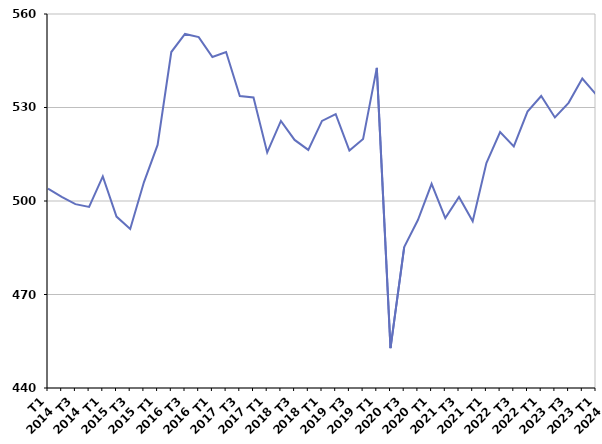
| Category | Ensemble des entrées en catégories A, B, C |
|---|---|
| T1
2014 | 504 |
| T2
2014 | 501.3 |
| T3
2014 | 499 |
| T4
2014 | 498.1 |
| T1
2015 | 507.9 |
| T2
2015 | 495 |
| T3
2015 | 491 |
| T4
2015 | 506 |
| T1
2016 | 518 |
| T2
2016 | 547.8 |
| T3
2016 | 553.6 |
| T4
2016 | 552.6 |
| T1
2017 | 546.2 |
| T2
2017 | 547.8 |
| T3
2017 | 533.7 |
| T4
2017 | 533.2 |
| T1
2018 | 515.6 |
| T2
2018 | 525.7 |
| T3
2018 | 519.6 |
| T4
2018 | 516.4 |
| T1
2019 | 525.7 |
| T2
2019 | 527.9 |
| T3
2019 | 516.2 |
| T4
2019 | 519.9 |
| T1
2020 | 542.7 |
| T2
2020 | 452.8 |
| T3
2020 | 485.2 |
| T4
2020 | 493.9 |
| T1
2021 | 505.5 |
| T2
2021 | 494.5 |
| T3
2021 | 501.3 |
| T4
2021 | 493.5 |
| T1
2022 | 512.2 |
| T2
2022 | 522.1 |
| T3
2022 | 517.5 |
| T4
2022 | 528.7 |
| T1
2023 | 533.7 |
| T2
2023 | 526.8 |
| T3
2023 | 531.5 |
| T4
2023 | 539.3 |
| T1
2024 | 534.2 |